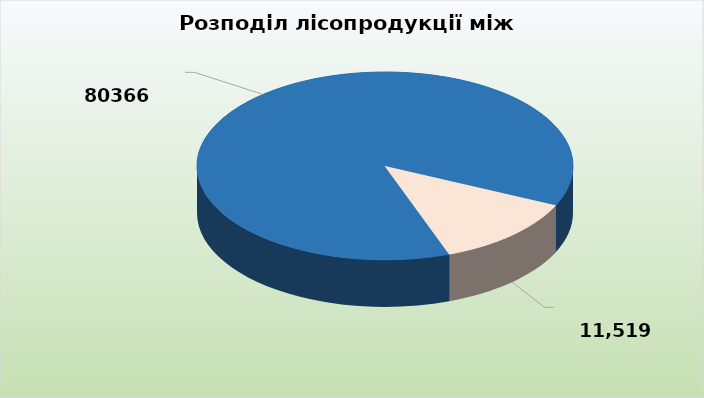
| Category | Series 0 |
|---|---|
| Покупці Рахівського р-ну, в.т.ч ВГСМ-13208 м3, ЕВК-10867 м3, населення-26862 м3, бюджетні установи-1966м3 Разом- | 80365.81 |
| Покупці за меж Рахівського району | 11519.041 |